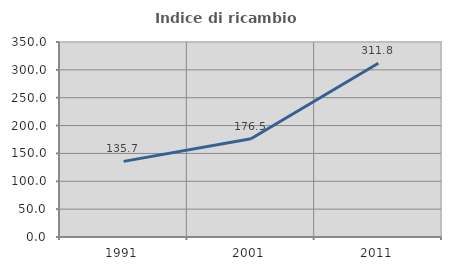
| Category | Indice di ricambio occupazionale  |
|---|---|
| 1991.0 | 135.739 |
| 2001.0 | 176.458 |
| 2011.0 | 311.829 |